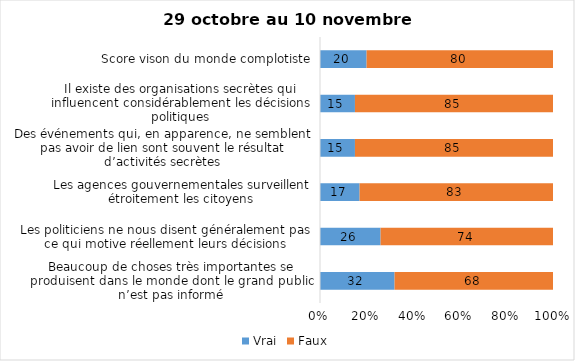
| Category | Vrai | Faux |
|---|---|---|
| Beaucoup de choses très importantes se produisent dans le monde dont le grand public n’est pas informé | 32 | 68 |
| Les politiciens ne nous disent généralement pas ce qui motive réellement leurs décisions | 26 | 74 |
| Les agences gouvernementales surveillent étroitement les citoyens | 17 | 83 |
| Des événements qui, en apparence, ne semblent pas avoir de lien sont souvent le résultat d’activités secrètes | 15 | 85 |
| Il existe des organisations secrètes qui influencent considérablement les décisions politiques | 15 | 85 |
| Score vison du monde complotiste | 20 | 80 |